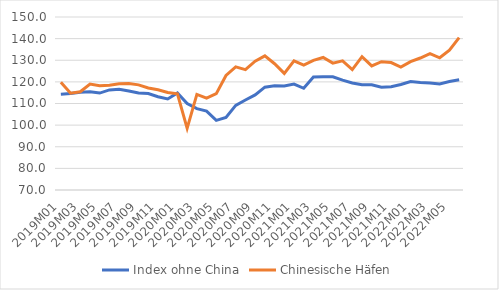
| Category | Index ohne China | Chinesische Häfen |
|---|---|---|
| 2019M01 | 114.316 | 119.828 |
| 2019M02 | 114.612 | 114.756 |
| 2019M03 | 115.221 | 115.452 |
| 2019M04 | 115.467 | 118.979 |
| 2019M05 | 114.819 | 118.211 |
| 2019M06 | 116.271 | 118.478 |
| 2019M07 | 116.621 | 119.084 |
| 2019M08 | 115.756 | 119.236 |
| 2019M09 | 114.873 | 118.623 |
| 2019M10 | 114.596 | 117.163 |
| 2019M11 | 113.114 | 116.378 |
| 2019M12 | 112.086 | 115.117 |
| 2020M01 | 114.914 | 114.491 |
| 2020M02 | 109.952 | 98.519 |
| 2020M03 | 107.623 | 114.2 |
| 2020M04 | 106.465 | 112.479 |
| 2020M05 | 102.214 | 114.553 |
| 2020M06 | 103.535 | 122.952 |
| 2020M07 | 109.152 | 126.935 |
| 2020M08 | 111.637 | 125.649 |
| 2020M09 | 113.985 | 129.585 |
| 2020M10 | 117.545 | 132.028 |
| 2020M11 | 118.215 | 128.397 |
| 2020M12 | 118.054 | 123.929 |
| 2021M01 | 119.016 | 129.716 |
| 2021M02 | 117.043 | 127.723 |
| 2021M03 | 122.288 | 129.975 |
| 2021M04 | 122.397 | 131.286 |
| 2021M05 | 122.344 | 128.654 |
| 2021M06 | 120.82 | 129.71 |
| 2021M07 | 119.515 | 125.67 |
| 2021M08 | 118.651 | 131.658 |
| 2021M09 | 118.684 | 127.38 |
| 2021M10 | 117.547 | 129.309 |
| 2021M11 | 117.743 | 128.922 |
| 2021M12 | 118.815 | 126.827 |
| 2022M01 | 120.2 | 129.347 |
| 2022M02 | 119.666 | 131.031 |
| 2022M03 | 119.527 | 133.105 |
| 2022M04 | 118.992 | 131.141 |
| 2022M05 | 120.18 | 134.685 |
| 2022M06 | 120.986 | 140.455 |